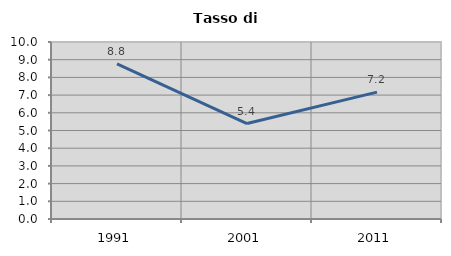
| Category | Tasso di disoccupazione   |
|---|---|
| 1991.0 | 8.765 |
| 2001.0 | 5.395 |
| 2011.0 | 7.168 |